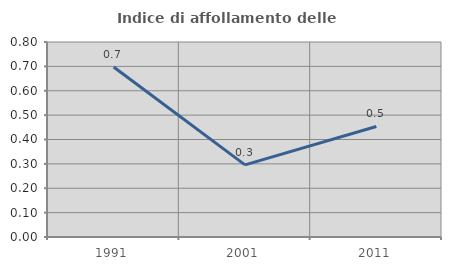
| Category | Indice di affollamento delle abitazioni  |
|---|---|
| 1991.0 | 0.697 |
| 2001.0 | 0.296 |
| 2011.0 | 0.454 |